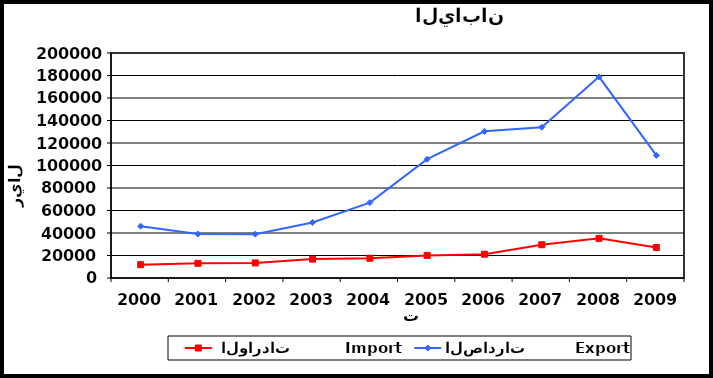
| Category |  الواردات           Import | الصادرات          Export |
|---|---|---|
| 2000.0 | 11837 | 46074 |
| 2001.0 | 13042 | 39099 |
| 2002.0 | 13405 | 38974 |
| 2003.0 | 16797 | 49325 |
| 2004.0 | 17555 | 67006 |
| 2005.0 | 20093 | 105580 |
| 2006.0 | 21146 | 130369 |
| 2007.0 | 29563 | 134007 |
| 2008.0 | 35251 | 178823 |
| 2009.0 | 27142 | 108956 |